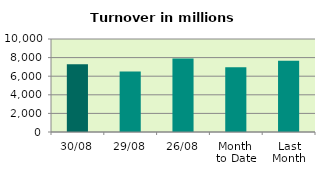
| Category | Series 0 |
|---|---|
| 30/08 | 7275.502 |
| 29/08 | 6509.664 |
| 26/08 | 7903.497 |
| Month 
to Date | 6953.489 |
| Last
Month | 7648.819 |